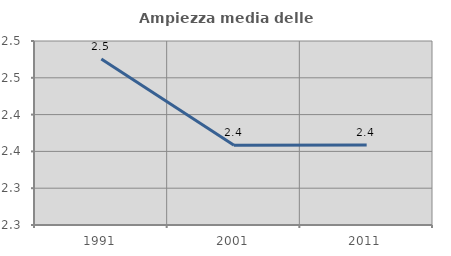
| Category | Ampiezza media delle famiglie |
|---|---|
| 1991.0 | 2.476 |
| 2001.0 | 2.358 |
| 2011.0 | 2.359 |